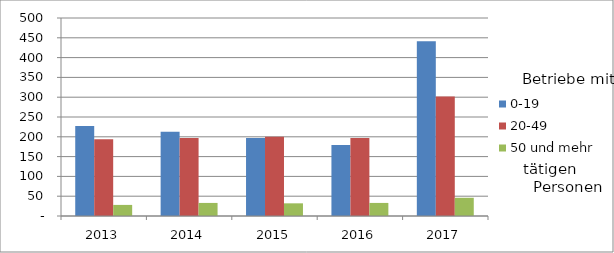
| Category | 0-19 | 20-49 | 50 und mehr |
|---|---|---|---|
| 2013.0 | 227 | 194 | 28 |
| 2014.0 | 213 | 197 | 33 |
| 2015.0 | 197 | 200 | 32 |
| 2016.0 | 179 | 197 | 33 |
| 2017.0 | 441 | 302 | 46 |